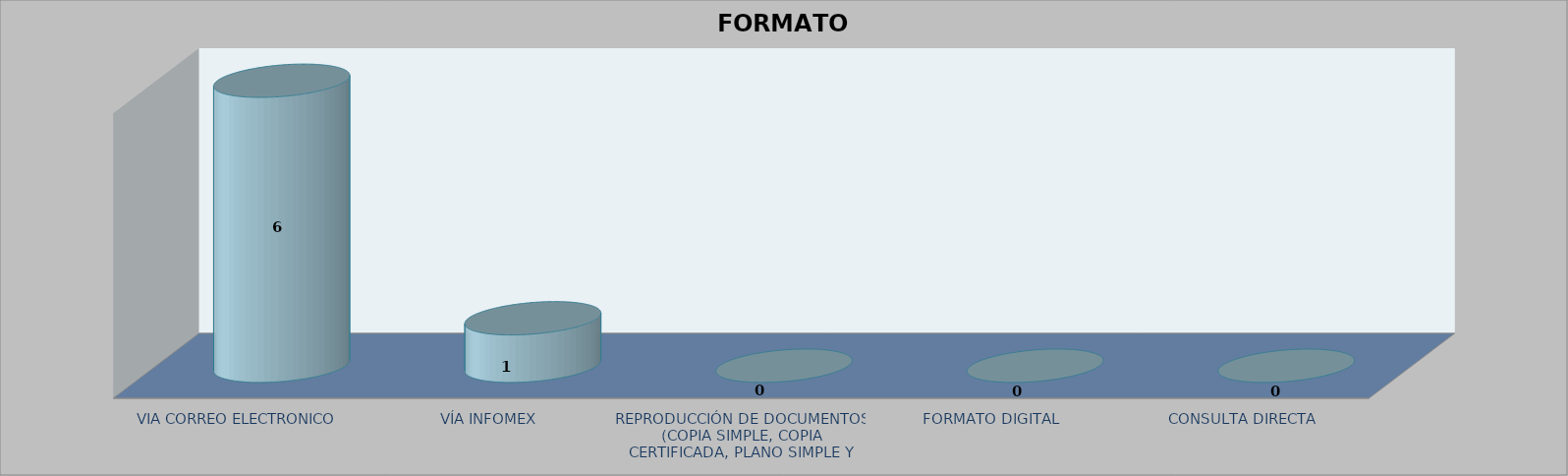
| Category |        FORMATO SOLICITADO | Series 1 | Series 2 |
|---|---|---|---|
| VIA CORREO ELECTRONICO |  |  | 6 |
| VÍA INFOMEX |  |  | 1 |
| REPRODUCCIÓN DE DOCUMENTOS (COPIA SIMPLE, COPIA CERTIFICADA, PLANO SIMPLE Y PLANO CERTIFICADO) |  |  | 0 |
| FORMATO DIGITAL |  |  | 0 |
| CONSULTA DIRECTA |  |  | 0 |